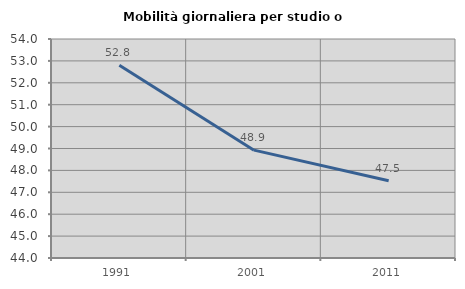
| Category | Mobilità giornaliera per studio o lavoro |
|---|---|
| 1991.0 | 52.799 |
| 2001.0 | 48.924 |
| 2011.0 | 47.527 |